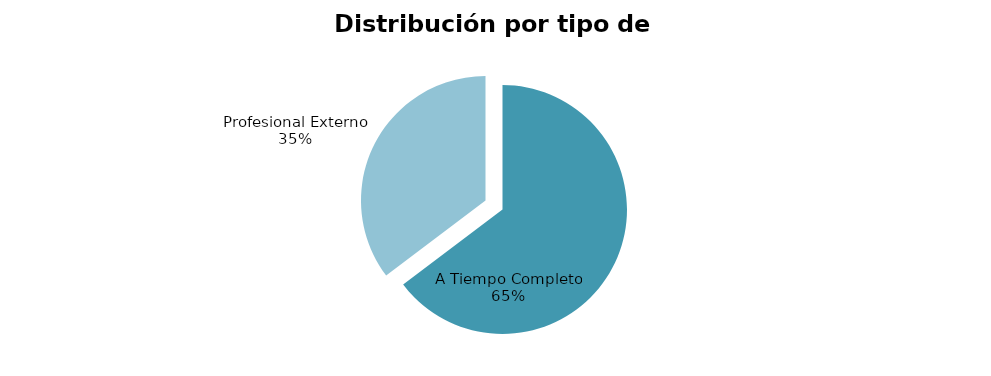
| Category | Series 0 |
|---|---|
| A Tiempo Completo | 11 |
| Profesional Externo | 6 |